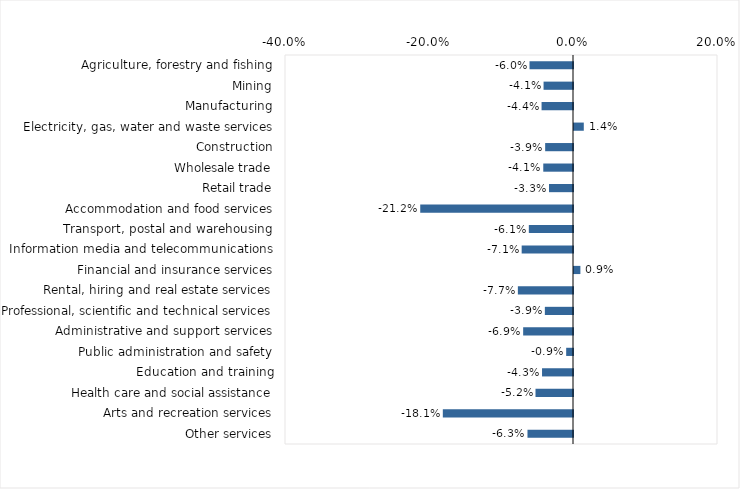
| Category | This week |
|---|---|
| Agriculture, forestry and fishing | -0.06 |
| Mining | -0.041 |
| Manufacturing | -0.044 |
| Electricity, gas, water and waste services | 0.014 |
| Construction | -0.039 |
| Wholesale trade | -0.041 |
| Retail trade | -0.033 |
| Accommodation and food services | -0.212 |
| Transport, postal and warehousing | -0.061 |
| Information media and telecommunications | -0.071 |
| Financial and insurance services | 0.009 |
| Rental, hiring and real estate services | -0.077 |
| Professional, scientific and technical services | -0.039 |
| Administrative and support services | -0.069 |
| Public administration and safety | -0.009 |
| Education and training | -0.043 |
| Health care and social assistance | -0.052 |
| Arts and recreation services | -0.181 |
| Other services | -0.063 |